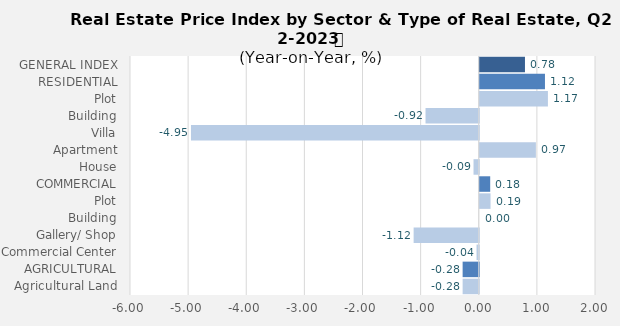
| Category | Q2- 2022 |
|---|---|
| GENERAL INDEX | 0.778 |
| RESIDENTIAL | 1.122 |
| Plot | 1.173 |
| Building | -0.916 |
| Villa | -4.951 |
| Apartment | 0.966 |
| House | -0.09 |
| COMMERCIAL | 0.18 |
| Plot | 0.186 |
| Building | 0 |
| Gallery/ Shop | -1.12 |
| Commercial Center | -0.038 |
| AGRICULTURAL | -0.277 |
| Agricultural Land | -0.277 |